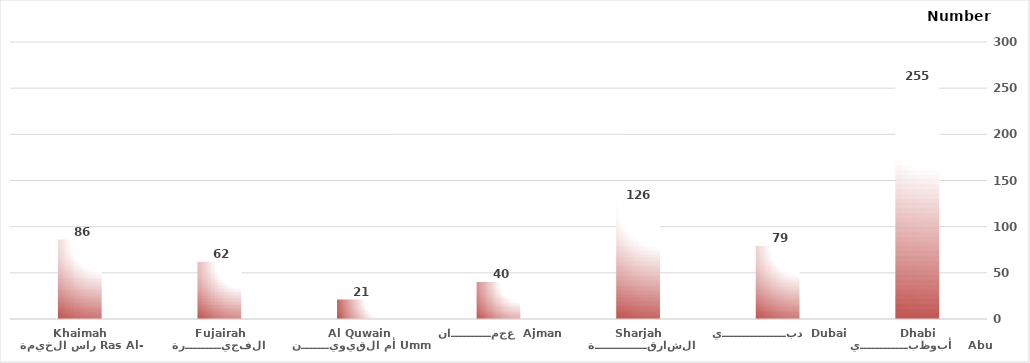
| Category | المدارس Schools |
|---|---|
| أبوظبــــــــــــي    Abu Dhabi | 255 |
| دبــــــــــــــــي  Dubai | 79 |
| الشارقـــــــــــــة Sharjah | 126 |
| عجمــــــــــان  Ajman | 40 |
| أم القيويـــــــن Umm Al Quwain | 21 |
| الفجيـــــــــرة   Fujairah | 62 |
| راس الخيمة Ras Al- Khaimah | 86 |